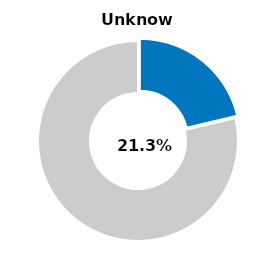
| Category | Series 0 |
|---|---|
| Unknown | 0.213 |
| Other | 0.787 |